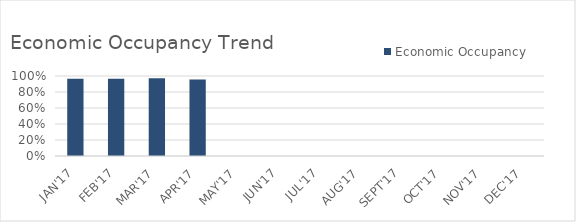
| Category | Economic Occupancy |
|---|---|
| JAN'17 | 0.966 |
| FEB'17 | 0.966 |
| MAR'17 | 0.973 |
| APR'17 | 0.958 |
| MAY'17 | 0 |
| JUN'17 | 0 |
| JUL'17 | 0 |
| AUG'17 | 0 |
| SEPT'17 | 0 |
| OCT'17 | 0 |
| NOV'17 | 0 |
| DEC'17 | 0 |